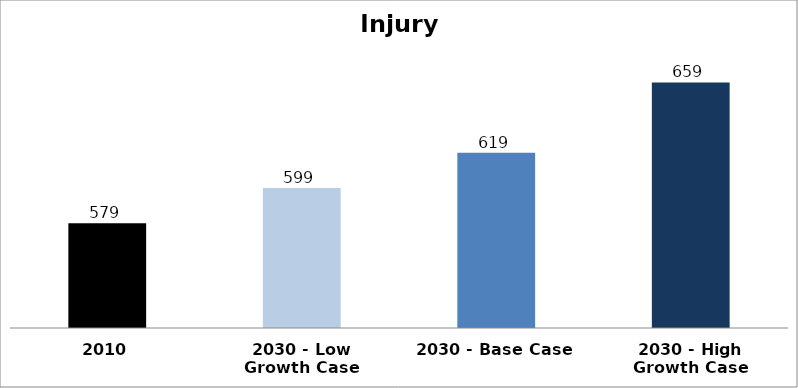
| Category | Injury Rate |
|---|---|
| 2010 | 579.405 |
| 2030 - Low Growth Case | 599.386 |
| 2030 - Base Case | 619.367 |
| 2030 - High Growth Case | 659.328 |